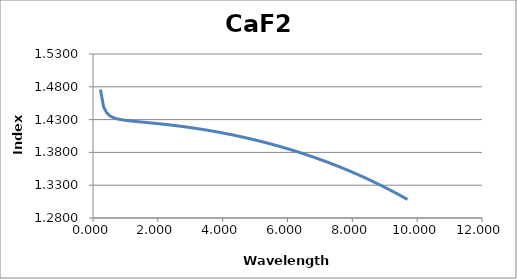
| Category | CaF2 |
|---|---|
| 0.23 | 1.476 |
| 0.3256566 | 1.45 |
| 0.4213131 | 1.44 |
| 0.5169697 | 1.436 |
| 0.6126263 | 1.433 |
| 0.7082828 | 1.432 |
| 0.8039394 | 1.43 |
| 0.899596 | 1.43 |
| 0.9952525 | 1.429 |
| 1.090909 | 1.428 |
| 1.186566 | 1.428 |
| 1.282222 | 1.427 |
| 1.377879 | 1.427 |
| 1.473535 | 1.426 |
| 1.569192 | 1.426 |
| 1.664848 | 1.425 |
| 1.760505 | 1.425 |
| 1.856162 | 1.425 |
| 1.951818 | 1.424 |
| 2.047475 | 1.424 |
| 2.143131 | 1.423 |
| 2.238788 | 1.423 |
| 2.334444 | 1.422 |
| 2.430101 | 1.422 |
| 2.525758 | 1.421 |
| 2.621414 | 1.42 |
| 2.717071 | 1.42 |
| 2.812727 | 1.419 |
| 2.908384 | 1.418 |
| 3.00404 | 1.418 |
| 3.099697 | 1.417 |
| 3.195354 | 1.416 |
| 3.29101 | 1.416 |
| 3.386667 | 1.415 |
| 3.482323 | 1.414 |
| 3.57798 | 1.413 |
| 3.673636 | 1.413 |
| 3.769293 | 1.412 |
| 3.864949 | 1.411 |
| 3.960606 | 1.41 |
| 4.056263 | 1.409 |
| 4.151919 | 1.408 |
| 4.247576 | 1.407 |
| 4.343232 | 1.406 |
| 4.438889 | 1.405 |
| 4.534545 | 1.404 |
| 4.630202 | 1.403 |
| 4.725859 | 1.402 |
| 4.821515 | 1.401 |
| 4.917172 | 1.4 |
| 5.012828 | 1.399 |
| 5.108485 | 1.398 |
| 5.204141 | 1.396 |
| 5.299798 | 1.395 |
| 5.395455 | 1.394 |
| 5.491111 | 1.393 |
| 5.586768 | 1.391 |
| 5.682424 | 1.39 |
| 5.778081 | 1.389 |
| 5.873737 | 1.387 |
| 5.969394 | 1.386 |
| 6.065051 | 1.385 |
| 6.160707 | 1.383 |
| 6.256364 | 1.382 |
| 6.35202 | 1.38 |
| 6.447677 | 1.379 |
| 6.543333 | 1.377 |
| 6.63899 | 1.376 |
| 6.734646 | 1.374 |
| 6.830303 | 1.372 |
| 6.92596 | 1.371 |
| 7.021616 | 1.369 |
| 7.117273 | 1.367 |
| 7.212929 | 1.365 |
| 7.308586 | 1.364 |
| 7.404242 | 1.362 |
| 7.499899 | 1.36 |
| 7.595556 | 1.358 |
| 7.691212 | 1.356 |
| 7.786869 | 1.354 |
| 7.882525 | 1.352 |
| 7.978182 | 1.35 |
| 8.073838 | 1.348 |
| 8.169495 | 1.346 |
| 8.265152 | 1.344 |
| 8.360808 | 1.342 |
| 8.456465 | 1.34 |
| 8.552121 | 1.338 |
| 8.647778 | 1.335 |
| 8.743434 | 1.333 |
| 8.839091 | 1.331 |
| 8.934747 | 1.328 |
| 9.030404 | 1.326 |
| 9.126061 | 1.324 |
| 9.221717 | 1.321 |
| 9.317374 | 1.319 |
| 9.41303 | 1.316 |
| 9.508687 | 1.314 |
| 9.604343 | 1.311 |
| 9.7 | 1.308 |